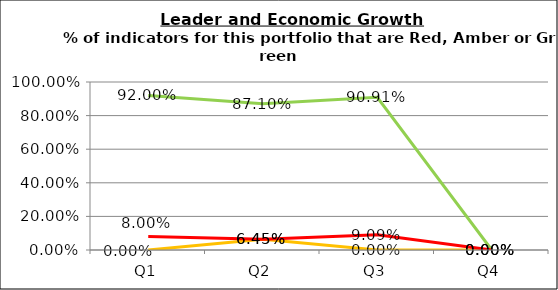
| Category | Green | Amber | Red |
|---|---|---|---|
| Q1 | 0.92 | 0 | 0.08 |
| Q2 | 0.871 | 0.065 | 0.065 |
| Q3 | 0.909 | 0 | 0.091 |
| Q4 | 0 | 0 | 0 |